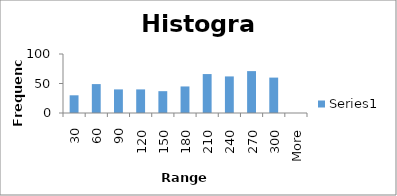
| Category | Series 0 |
|---|---|
| 30 | 30 |
| 60 | 49 |
| 90 | 40 |
| 120 | 40 |
| 150 | 37 |
| 180 | 45 |
| 210 | 66 |
| 240 | 62 |
| 270 | 71 |
| 300 | 60 |
| More | 0 |